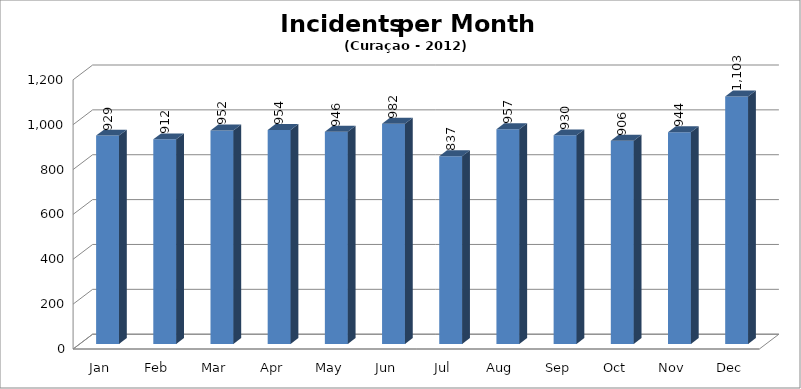
| Category | Series 0 |
|---|---|
| Jan | 929 |
| Feb | 912 |
| Mar | 952 |
| Apr | 954 |
| May | 946 |
| Jun | 982 |
| Jul | 837 |
| Aug | 957 |
| Sep | 930 |
| Oct | 906 |
| Nov | 944 |
| Dec | 1103 |